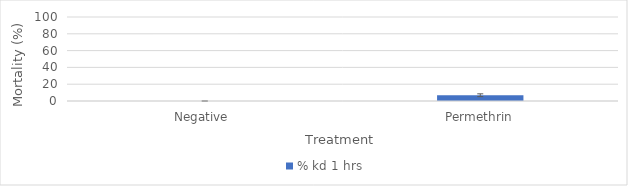
| Category | % kd 1 hrs |
|---|---|
| Negative  | 0 |
| Permethrin | 6.863 |